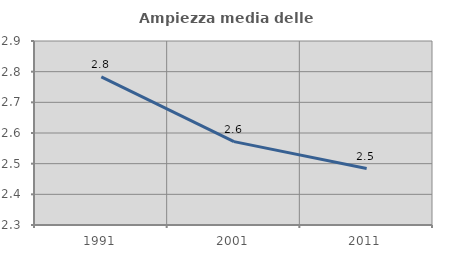
| Category | Ampiezza media delle famiglie |
|---|---|
| 1991.0 | 2.783 |
| 2001.0 | 2.572 |
| 2011.0 | 2.484 |